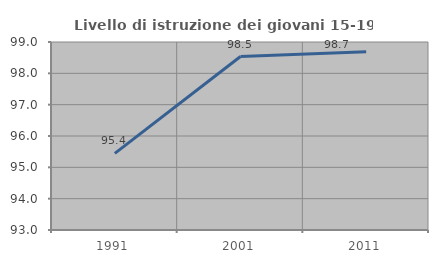
| Category | Livello di istruzione dei giovani 15-19 anni |
|---|---|
| 1991.0 | 95.444 |
| 2001.0 | 98.537 |
| 2011.0 | 98.692 |